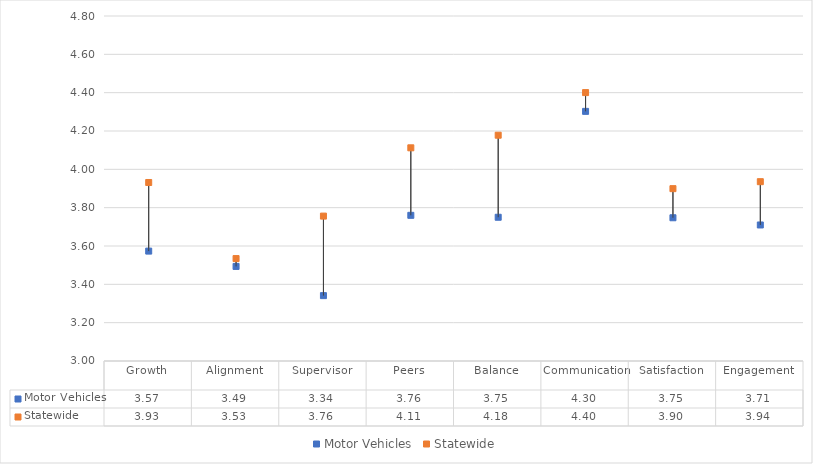
| Category | Motor Vehicles | Statewide |
|---|---|---|
| Growth | 3.573 | 3.931 |
| Alignment | 3.493 | 3.534 |
| Supervisor | 3.341 | 3.756 |
| Peers | 3.76 | 4.112 |
| Balance | 3.75 | 4.178 |
| Communication | 4.302 | 4.4 |
| Satisfaction | 3.747 | 3.899 |
| Engagement | 3.71 | 3.936 |